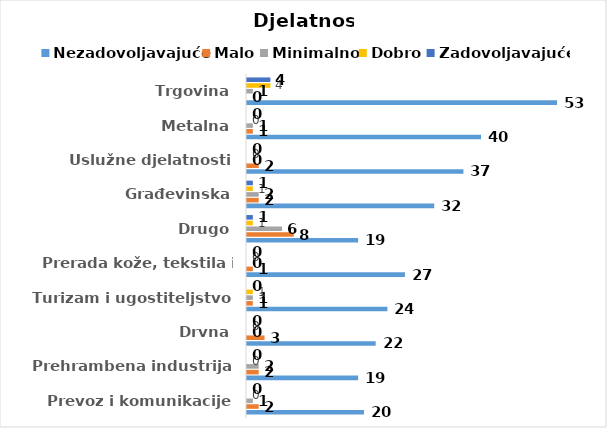
| Category | Nezadovoljavajuće | Malo | Minimalno | Dobro | Zadovoljavajuće |
|---|---|---|---|---|---|
| Prevoz i komunikacije | 20 | 2 | 1 | 0 | 0 |
| Prehrambena industrija | 19 | 2 | 2 | 0 | 0 |
| Drvna | 22 | 3 | 0 | 0 | 0 |
| Turizam i ugostiteljstvo | 24 | 1 | 1 | 1 | 0 |
| Prerada kože, tekstila i obuće | 27 | 1 | 0 | 0 | 0 |
| Drugo | 19 | 8 | 6 | 1 | 1 |
| Građevinska | 32 | 2 | 2 | 1 | 1 |
| Uslužne djelatnosti | 37 | 2 | 0 | 0 | 0 |
| Metalna | 40 | 1 | 1 | 0 | 0 |
| Trgovina | 53 | 0 | 1 | 4 | 4 |